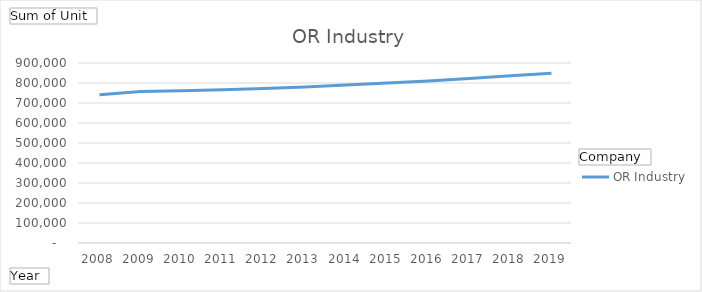
| Category | OR Industry |
|---|---|
| 2008 | 740883 |
| 2009 | 757217 |
| 2010 | 760886 |
| 2011 | 766566 |
| 2012 | 772512 |
| 2013 | 780249 |
| 2014 | 789688 |
| 2015 | 799627 |
| 2016 | 810301 |
| 2017 | 822919 |
| 2018 | 836280 |
| 2019 | 848999 |